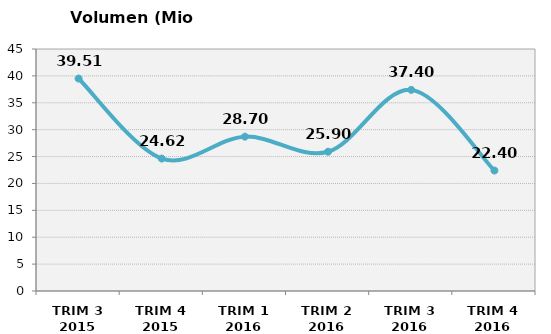
| Category | Volumen (Mio consumiciones) |
|---|---|
| TRIM 3 2015 | 39.506 |
| TRIM 4 2015 | 24.623 |
| TRIM 1 2016 | 28.7 |
| TRIM 2 2016 | 25.9 |
| TRIM 3 2016 | 37.4 |
| TRIM 4 2016 | 22.4 |